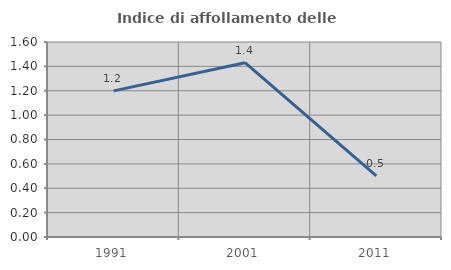
| Category | Indice di affollamento delle abitazioni  |
|---|---|
| 1991.0 | 1.199 |
| 2001.0 | 1.43 |
| 2011.0 | 0.501 |